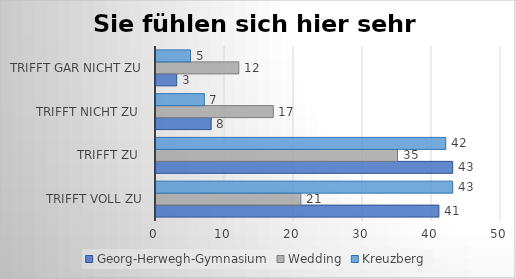
| Category | Georg-Herwegh-Gymnasium | Wedding | Kreuzberg |
|---|---|---|---|
| trifft voll zu | 41 | 21 | 43 |
| trifft zu  | 43 | 35 | 42 |
| trifft nicht zu  | 8 | 17 | 7 |
| trifft gar nicht zu | 3 | 12 | 5 |